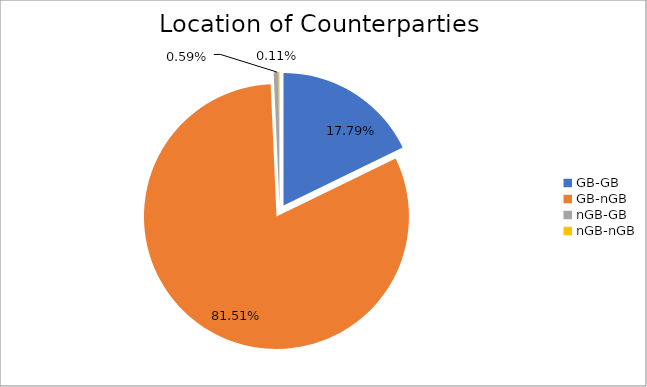
| Category | Series 0 |
|---|---|
| GB-GB | 1664475.027 |
| GB-nGB | 7627955.494 |
| nGB-GB | 55620.695 |
| nGB-nGB | 10322.424 |